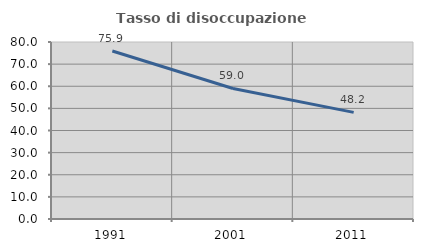
| Category | Tasso di disoccupazione giovanile  |
|---|---|
| 1991.0 | 75.926 |
| 2001.0 | 58.997 |
| 2011.0 | 48.197 |